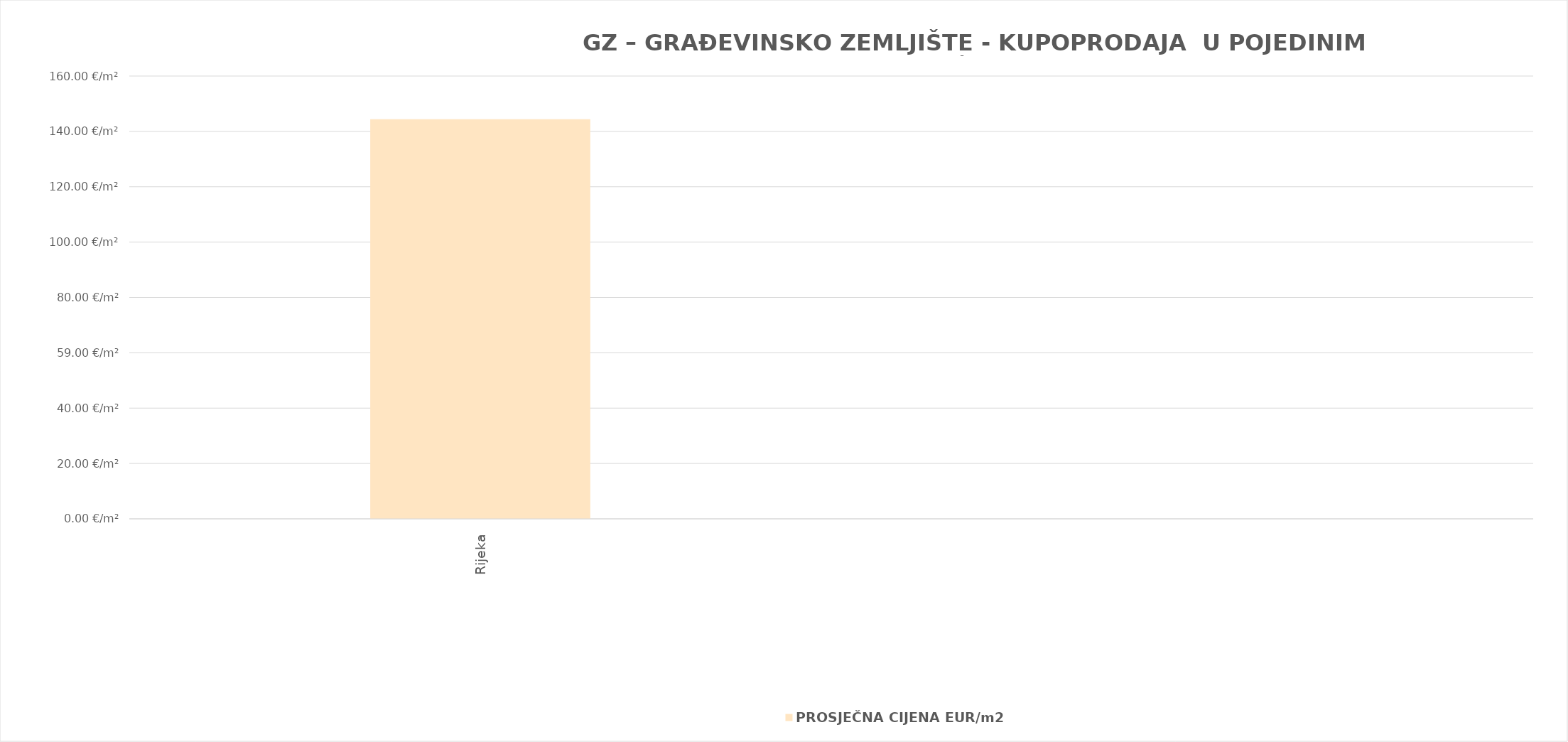
| Category | PROSJEČNA CIJENA EUR/m2 |
|---|---|
| Rijeka | 1900-05-23 08:50:15 |